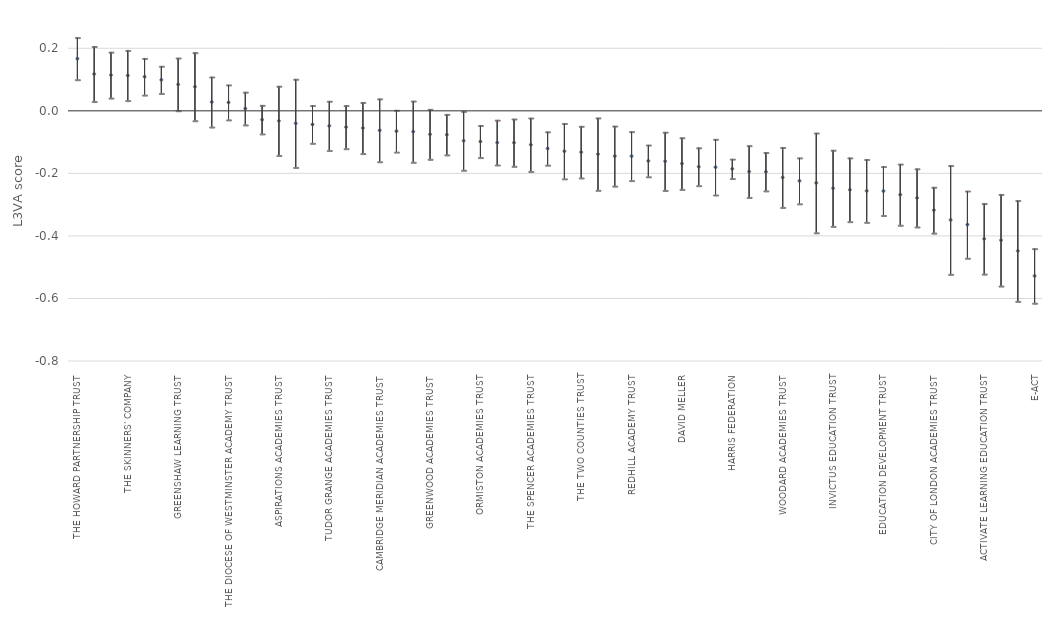
| Category | VA_MAT_ACVQ | UCI_MAT_ACVQ | LCI_MAT_ACVQ |
|---|---|---|---|
| THE HOWARD PARTNERSHIP TRUST | 0.167 | 0.234 | 0.099 |
| ALDRIDGE EDUCATION | 0.118 | 0.206 | 0.03 |
| INSPIRATION TRUST | 0.114 | 0.188 | 0.041 |
| THE SKINNERS' COMPANY | 0.113 | 0.193 | 0.033 |
| EAST MIDLANDS EDUCATION TRUST | 0.109 | 0.168 | 0.05 |
| DIOCESE OF LONDON | 0.099 | 0.143 | 0.055 |
| GREENSHAW LEARNING TRUST | 0.085 | 0.169 | 0 |
| NORTHERN EDUCATION TRUST | 0.077 | 0.186 | -0.032 |
| CASTLE SCHOOL EDUCATION TRUST | 0.028 | 0.108 | -0.052 |
| THE DIOCESE OF WESTMINSTER ACADEMY TRUST | 0.027 | 0.083 | -0.029 |
| ARK SCHOOLS | 0.007 | 0.06 | -0.045 |
| UNITED LEARNING TRUST | -0.028 | 0.018 | -0.074 |
| ASPIRATIONS ACADEMIES TRUST | -0.032 | 0.079 | -0.143 |
| EDUCATION CENTRAL MULTI ACADEMY TRUST | -0.04 | 0.101 | -0.181 |
| DIVERSE ACADEMIES TRUST | -0.044 | 0.017 | -0.104 |
| TUDOR GRANGE ACADEMIES TRUST | -0.048 | 0.031 | -0.127 |
| KENT CATHOLIC SCHOOLS' PARTNERSHIP | -0.052 | 0.017 | -0.121 |
| THE CARDINAL HUME ACADEMIES TRUST | -0.055 | 0.027 | -0.137 |
| CAMBRIDGE MERIDIAN ACADEMIES TRUST | -0.062 | 0.038 | -0.163 |
| THE BROOKE WESTON TRUST | -0.065 | 0.002 | -0.132 |
| WELLSWAY MULTI ACADEMY TRUST | -0.067 | 0.031 | -0.164 |
| GREENWOOD ACADEMIES TRUST | -0.075 | 0.005 | -0.155 |
| LEIGH ACADEMIES TRUST | -0.076 | -0.011 | -0.141 |
| DELTA ACADEMIES TRUST | -0.096 | -0.002 | -0.19 |
| ORMISTON ACADEMIES TRUST | -0.098 | -0.047 | -0.15 |
| THE PRIORY FEDERATION OF ACADEMIES | -0.102 | -0.03 | -0.173 |
| LOXFORD SCHOOL TRUST LTD | -0.102 | -0.026 | -0.177 |
| THE SPENCER ACADEMIES TRUST | -0.108 | -0.023 | -0.194 |
| THE HABERDASHERS' LIVERY COMPANY | -0.12 | -0.067 | -0.174 |
| CREATIVE EDUCATION TRUST | -0.129 | -0.041 | -0.218 |
| THE TWO COUNTIES TRUST | -0.132 | -0.05 | -0.215 |
| NORTHERN SCHOOLS TRUST | -0.138 | -0.023 | -0.254 |
| EMMANUEL SCHOOLS FOUNDATION | -0.145 | -0.049 | -0.241 |
| REDHILL ACADEMY TRUST | -0.145 | -0.067 | -0.223 |
| ACADEMIES ENTERPRISE TRUST (AET) | -0.16 | -0.109 | -0.211 |
| OASIS COMMUNITY LEARNING | -0.161 | -0.068 | -0.255 |
| DAVID MELLER | -0.169 | -0.086 | -0.251 |
| OUTWOOD GRANGE ACADEMIES TRUST | -0.179 | -0.118 | -0.239 |
| FORT PITT THOMAS AVELING ACADEMIES | -0.18 | -0.091 | -0.269 |
| HARRIS FEDERATION | -0.186 | -0.154 | -0.217 |
| DIXONS ACADEMIES CHARITABLE TRUST LTD | -0.194 | -0.112 | -0.277 |
| THE KEMNAL ACADEMIES TRUST | -0.195 | -0.133 | -0.256 |
| WOODARD ACADEMIES TRUST | -0.213 | -0.117 | -0.309 |
| THE THINKING SCHOOLS ACADEMY TRUST | -0.224 | -0.151 | -0.298 |
| SWALE ACADEMIES TRUST | -0.231 | -0.071 | -0.39 |
| INVICTUS EDUCATION TRUST | -0.248 | -0.126 | -0.369 |
| MATRIX ACADEMY TRUST | -0.253 | -0.151 | -0.354 |
| BRADFORD DIOCESAN ACADEMIES TRUST | -0.256 | -0.156 | -0.357 |
| EDUCATION DEVELOPMENT TRUST | -0.257 | -0.178 | -0.335 |
| ACADEMY TRANSFORMATION TRUST | -0.268 | -0.17 | -0.366 |
| THE DAVID ROSS EDUCATION TRUST | -0.278 | -0.185 | -0.372 |
| CITY OF LONDON ACADEMIES TRUST | -0.318 | -0.244 | -0.391 |
| DIOCESE OF OXFORD | -0.349 | -0.175 | -0.523 |
| LYDIATE LEARNING TRUST | -0.364 | -0.257 | -0.471 |
| ACTIVATE LEARNING EDUCATION TRUST | -0.409 | -0.297 | -0.522 |
| THE ROSEDALE HEWENS ACADEMY TRUST | -0.414 | -0.268 | -0.56 |
| GRACE FOUNDATION | -0.448 | -0.287 | -0.609 |
| E-ACT | -0.528 | -0.441 | -0.615 |